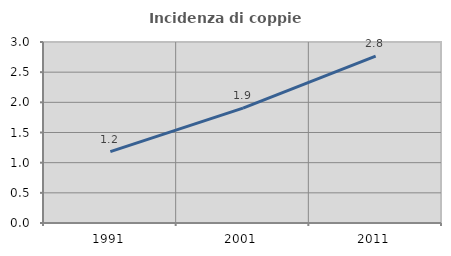
| Category | Incidenza di coppie miste |
|---|---|
| 1991.0 | 1.183 |
| 2001.0 | 1.903 |
| 2011.0 | 2.766 |